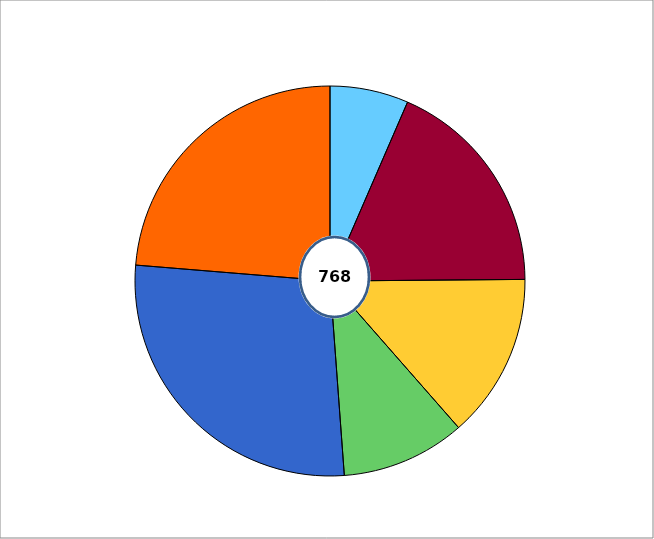
| Category | Series 1 |
|---|---|
| 0 | 50 |
| 1 | 141 |
| 2 | 105 |
| 3 | 79 |
| 4 | 211 |
| 5 | 182 |